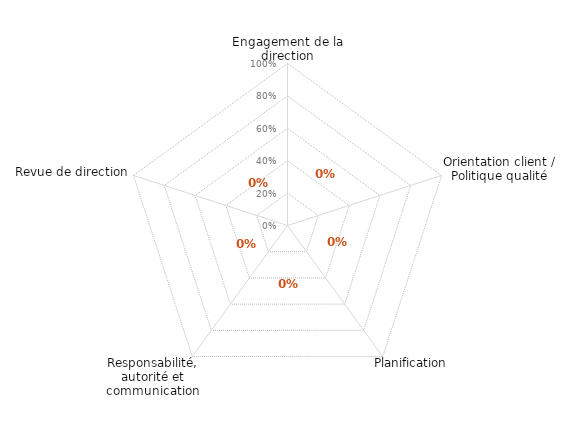
| Category | article 5 |
|---|---|
| 0 | 0 |
| 1 | 0 |
| 2 | 0 |
| 3 | 0 |
| 4 | 0 |